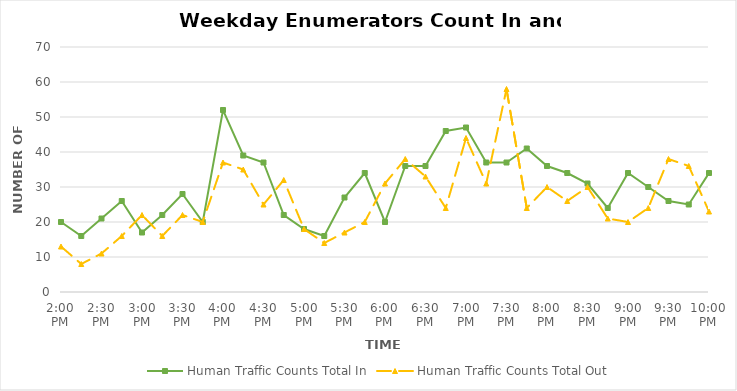
| Category | Human Traffic Counts Total In | Human Traffic Counts Total Out |
|---|---|---|
| 0.5833333333333334 | 20 | 13 |
| 0.59375 | 16 | 8 |
| 0.604166666666667 | 21 | 11 |
| 0.614583333333334 | 26 | 16 |
| 0.625 | 17 | 22 |
| 0.635416666666667 | 22 | 16 |
| 0.645833333333334 | 28 | 22 |
| 0.656250000000001 | 20 | 20 |
| 0.666666666666667 | 52 | 37 |
| 0.677083333333334 | 39 | 35 |
| 0.687500000000001 | 37 | 25 |
| 0.697916666666668 | 22 | 32 |
| 0.708333333333335 | 18 | 18 |
| 0.718750000000002 | 16 | 14 |
| 0.729166666666669 | 27 | 17 |
| 0.739583333333336 | 34 | 20 |
| 0.75 | 20 | 31 |
| 0.7604166666666666 | 36 | 38 |
| 0.7708333333333334 | 36 | 33 |
| 0.78125 | 46 | 24 |
| 0.7916666666666666 | 47 | 44 |
| 0.8020833333333334 | 37 | 31 |
| 0.8125 | 37 | 58 |
| 0.8229166666666666 | 41 | 24 |
| 0.8333333333333334 | 36 | 30 |
| 0.84375 | 34 | 26 |
| 0.8541666666666666 | 31 | 30 |
| 0.8645833333333334 | 24 | 21 |
| 0.875 | 34 | 20 |
| 0.8854166666666666 | 30 | 24 |
| 0.8958333333333334 | 26 | 38 |
| 0.90625 | 25 | 36 |
| 0.9166666666666666 | 34 | 23 |